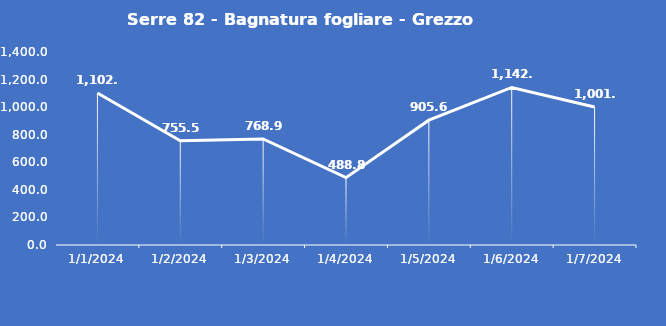
| Category | Serre 82 - Bagnatura fogliare - Grezzo (min) |
|---|---|
| 1/1/24 | 1102.7 |
| 1/2/24 | 755.5 |
| 1/3/24 | 768.9 |
| 1/4/24 | 488.8 |
| 1/5/24 | 905.6 |
| 1/6/24 | 1142.9 |
| 1/7/24 | 1001 |